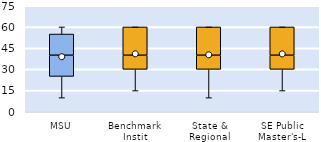
| Category | 25th | 50th | 75th |
|---|---|---|---|
| MSU | 25 | 15 | 15 |
| Benchmark Instit | 30 | 10 | 20 |
| State & Regional | 30 | 10 | 20 |
| SE Public Master's-L | 30 | 10 | 20 |